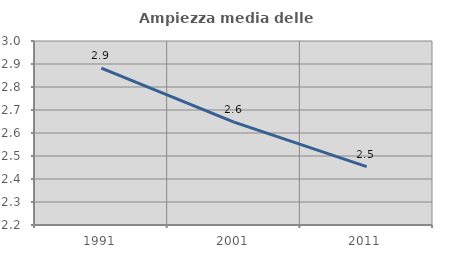
| Category | Ampiezza media delle famiglie |
|---|---|
| 1991.0 | 2.882 |
| 2001.0 | 2.647 |
| 2011.0 | 2.454 |